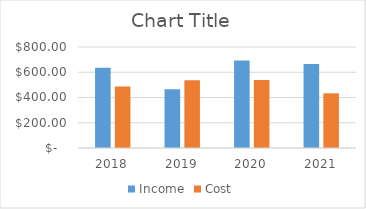
| Category | Income | Cost |
|---|---|---|
| 2018.0 | 636 | 488 |
| 2019.0 | 466 | 537 |
| 2020.0 | 694 | 539 |
| 2021.0 | 665 | 433 |